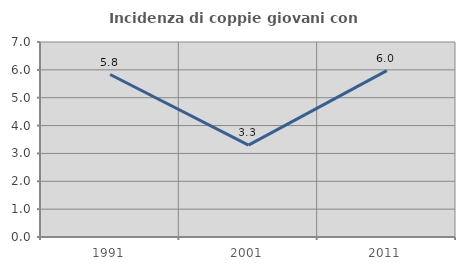
| Category | Incidenza di coppie giovani con figli |
|---|---|
| 1991.0 | 5.833 |
| 2001.0 | 3.297 |
| 2011.0 | 5.97 |